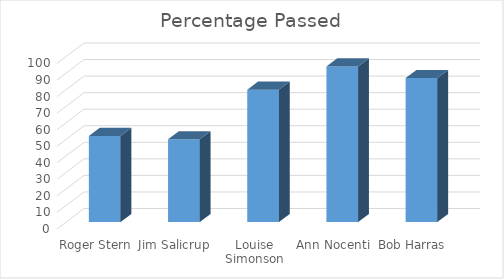
| Category | Percentage Passed |
|---|---|
| Roger Stern | 52 |
| Jim Salicrup | 50 |
| Louise Simonson | 80 |
| Ann Nocenti | 94 |
| Bob Harras | 87 |